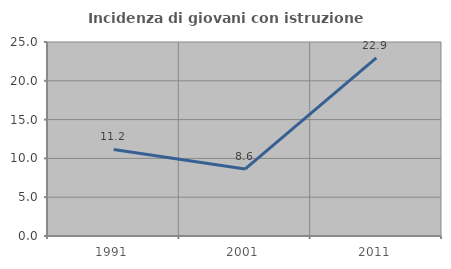
| Category | Incidenza di giovani con istruzione universitaria |
|---|---|
| 1991.0 | 11.159 |
| 2001.0 | 8.629 |
| 2011.0 | 22.941 |